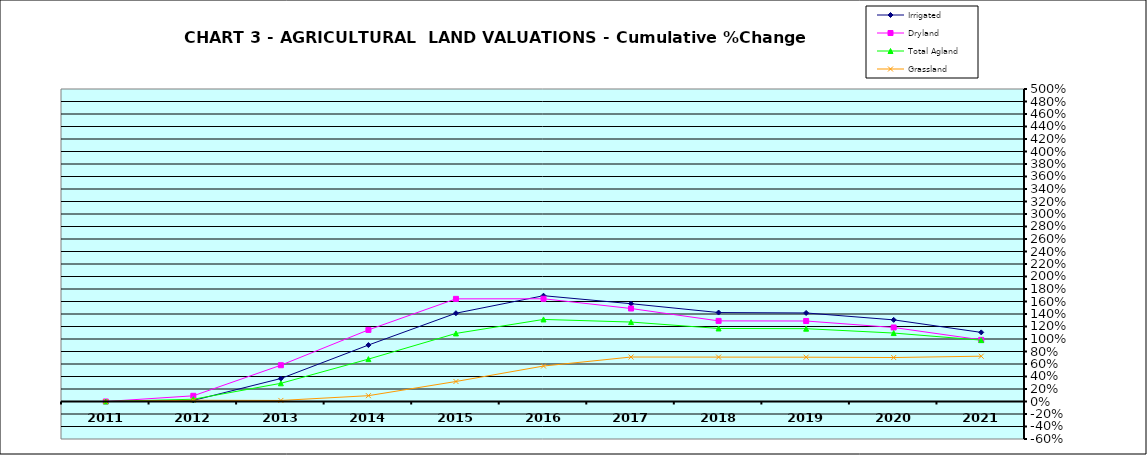
| Category | Irrigated | Dryland | Total Agland | Grassland |
|---|---|---|---|---|
| 2011.0 | 0 | 0 | 0 | 0 |
| 2012.0 | 0.017 | 0.091 | 0.036 | 0.02 |
| 2013.0 | 0.368 | 0.58 | 0.291 | 0.017 |
| 2014.0 | 0.903 | 1.146 | 0.678 | 0.093 |
| 2015.0 | 1.413 | 1.642 | 1.089 | 0.32 |
| 2016.0 | 1.693 | 1.644 | 1.313 | 0.567 |
| 2017.0 | 1.565 | 1.488 | 1.271 | 0.712 |
| 2018.0 | 1.423 | 1.29 | 1.169 | 0.71 |
| 2019.0 | 1.417 | 1.288 | 1.165 | 0.709 |
| 2020.0 | 1.306 | 1.184 | 1.095 | 0.704 |
| 2021.0 | 1.106 | 0.986 | 0.982 | 0.725 |